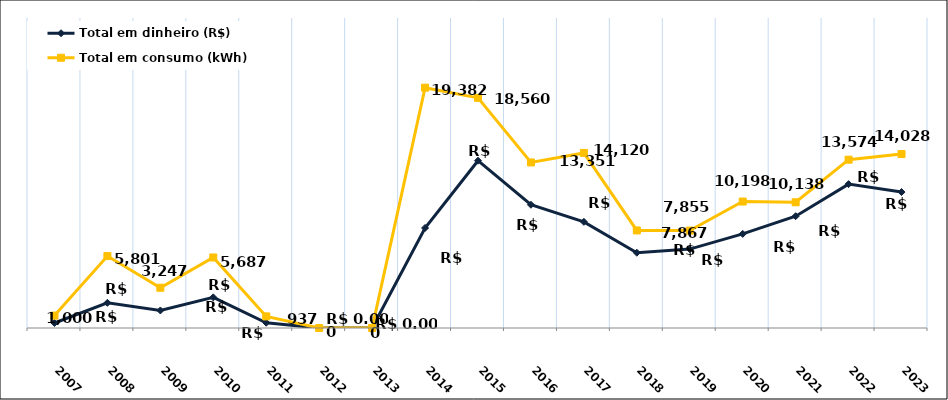
| Category | Total em dinheiro (R$) | Total em consumo (kWh) |
|---|---|---|
| 2007.0 | 403.67 | 1000 |
| 2008.0 | 2029.29 | 5801 |
| 2009.0 | 1413.83 | 3247 |
| 2010.0 | 2470.51 | 5687 |
| 2011.0 | 423.65 | 937 |
| 2012.0 | 0 | 0 |
| 2013.0 | 0 | 0 |
| 2014.0 | 8067.04 | 19382 |
| 2015.0 | 13491.36 | 18560 |
| 2016.0 | 9939.28 | 13351 |
| 2017.0 | 8560.69 | 14120 |
| 2018.0 | 6070.05 | 7867 |
| 2019.0 | 6363.14 | 7855 |
| 2020.0 | 7587.78 | 10198 |
| 2021.0 | 9017.35 | 10138 |
| 2022.0 | 11602.21 | 13574 |
| 2023.0 | 10964.78 | 14028 |